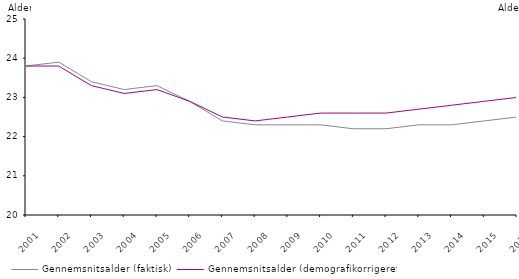
| Category | Gennemsnitsalder (faktisk) | Gennemsnitsalder (demografikorrigeret) |
|---|---|---|
| 2001.0 | 23.8 | 23.8 |
| 2002.0 | 23.9 | 23.8 |
| 2003.0 | 23.4 | 23.3 |
| 2004.0 | 23.2 | 23.1 |
| 2005.0 | 23.3 | 23.2 |
| 2006.0 | 22.9 | 22.9 |
| 2007.0 | 22.4 | 22.5 |
| 2008.0 | 22.3 | 22.4 |
| 2009.0 | 22.3 | 22.5 |
| 2010.0 | 22.3 | 22.6 |
| 2011.0 | 22.2 | 22.6 |
| 2012.0 | 22.2 | 22.6 |
| 2013.0 | 22.3 | 22.7 |
| 2014.0 | 22.3 | 22.8 |
| 2015.0 | 22.4 | 22.9 |
| 2016.0 | 22.5 | 23 |